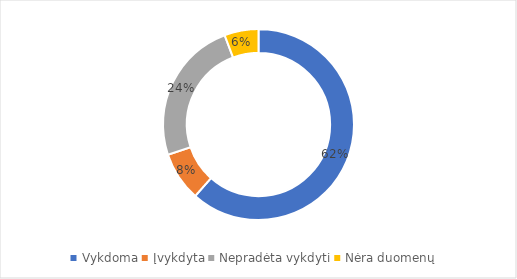
| Category | Proc. nuo visų |
|---|---|
| Vykdoma | 0.615 |
| Įvykdyta | 0.083 |
| Nepradėta vykdyti | 0.244 |
| Nėra duomenų | 0.058 |